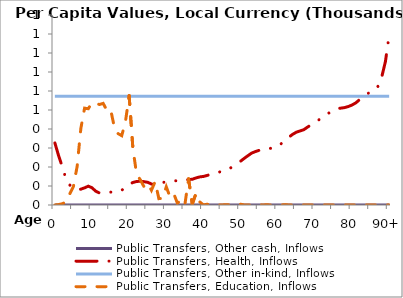
| Category | Public Transfers, Other cash, Inflows | Public Transfers, Health, Inflows | Public Transfers, Other in-kind, Inflows | Public Transfers, Education, Inflows |
|---|---|---|---|---|
| 0 |  | 326.771 | 571.883 | 0 |
|  |  | 260.133 | 571.883 | 2.152 |
| 2 |  | 200.45 | 571.883 | 6.611 |
| 3 |  | 138.189 | 571.883 | 15.562 |
| 4 |  | 105.639 | 571.883 | 57.939 |
| 5 |  | 87.557 | 571.883 | 97.819 |
| 6 |  | 81.91 | 571.883 | 203.356 |
| 7 |  | 83.429 | 571.883 | 403.116 |
| 8 |  | 90.201 | 571.883 | 509.614 |
| 9 |  | 99.107 | 571.883 | 506.586 |
| 10 |  | 90.861 | 571.883 | 539.106 |
| 11 |  | 72.533 | 571.883 | 535.388 |
| 12 |  | 63.577 | 571.883 | 528.841 |
| 13 |  | 66.558 | 571.883 | 534.799 |
| 14 |  | 68.829 | 571.883 | 498.797 |
| 15 |  | 67.85 | 571.883 | 503.946 |
| 16 |  | 67.335 | 571.883 | 411.075 |
| 17 |  | 71.136 | 571.883 | 375.938 |
| 18 |  | 76.992 | 571.883 | 364.817 |
| 19 |  | 95.173 | 571.883 | 437.792 |
| 20 |  | 109.585 | 571.883 | 575.775 |
| 21 |  | 118.436 | 571.883 | 299.664 |
| 22 |  | 123.668 | 571.883 | 163.576 |
| 23 |  | 125.186 | 571.883 | 132.816 |
| 24 |  | 122.707 | 571.883 | 96.485 |
| 25 |  | 119.461 | 571.883 | 114.422 |
| 26 |  | 110.525 | 571.883 | 77.42 |
| 27 |  | 105.346 | 571.883 | 123.636 |
| 28 |  | 110.222 | 571.883 | 33.491 |
| 29 |  | 117.898 | 571.883 | 34.989 |
| 30 |  | 122.45 | 571.883 | 95.406 |
| 31 |  | 125.161 | 571.883 | 42.806 |
| 32 |  | 126.845 | 571.883 | 60.748 |
| 33 |  | 127.813 | 571.883 | 9.056 |
| 34 |  | 127.737 | 571.883 | 28.261 |
| 35 |  | 130.981 | 571.883 | 0.731 |
| 36 |  | 134.041 | 571.883 | 137.513 |
| 37 |  | 135.422 | 571.883 | 4.242 |
| 38 |  | 142.395 | 571.883 | 61.302 |
| 39 |  | 147.836 | 571.883 | 16.477 |
| 40 |  | 150.302 | 571.883 | 0 |
| 41 |  | 155.512 | 571.883 | 4.089 |
| 42 |  | 161.835 | 571.883 | 0 |
| 43 |  | 166.944 | 571.883 | 0 |
| 44 |  | 172.242 | 571.883 | 0 |
| 45 |  | 176.963 | 571.883 | 0 |
| 46 |  | 181.09 | 571.883 | 1.752 |
| 47 |  | 191.093 | 571.883 | 0.669 |
| 48 |  | 204.48 | 571.883 | 0 |
| 49 |  | 216.029 | 571.883 | 0 |
| 50 |  | 230.619 | 571.883 | 4.276 |
| 51 |  | 245.515 | 571.883 | 0 |
| 52 |  | 259.864 | 571.883 | 0 |
| 53 |  | 273.279 | 571.883 | 0 |
| 54 |  | 281.254 | 571.883 | 0 |
| 55 |  | 287.91 | 571.883 | 1.675 |
| 56 |  | 293.536 | 571.883 | 0 |
| 57 |  | 297.444 | 571.883 | 1.467 |
| 58 |  | 297.966 | 571.883 | 0 |
| 59 |  | 300.331 | 571.883 | 0 |
| 60 |  | 308.209 | 571.883 | 0 |
| 61 |  | 323.827 | 571.883 | 0 |
| 62 |  | 338.489 | 571.883 | 1.98 |
| 63 |  | 357.164 | 571.883 | 0 |
| 64 |  | 371.649 | 571.883 | 0 |
| 65 |  | 383.05 | 571.883 | 0 |
| 66 |  | 389.644 | 571.883 | 0 |
| 67 |  | 396.037 | 571.883 | 0 |
| 68 |  | 409.586 | 571.883 | 0 |
| 69 |  | 421.654 | 571.883 | 0 |
| 70 |  | 434.866 | 571.883 | 0 |
| 71 |  | 447.18 | 571.883 | 0 |
| 72 |  | 460.372 | 571.883 | 0 |
| 73 |  | 473.322 | 571.883 | 0 |
| 74 |  | 487.287 | 571.883 | 0 |
| 75 |  | 499.781 | 571.883 | 0 |
| 76 |  | 507.413 | 571.883 | 0 |
| 77 |  | 509.826 | 571.883 | 0 |
| 78 |  | 512.723 | 571.883 | 0 |
| 79 |  | 518.235 | 571.883 | 0 |
| 80 |  | 526.158 | 571.883 | 0 |
| 81 |  | 537.283 | 571.883 | 0 |
| 82 |  | 553.624 | 571.883 | 0 |
| 83 |  | 570.665 | 571.883 | 0 |
| 84 |  | 584.395 | 571.883 | 0 |
| 85 |  | 593.8 | 571.883 | 0 |
| 86 |  | 602.092 | 571.883 | 0 |
| 87 |  | 624.698 | 571.883 | 0 |
| 88 |  | 673.285 | 571.883 | 0 |
| 89 |  | 755.036 | 571.883 | 0 |
| 90+ |  | 894.408 | 571.883 | 0 |